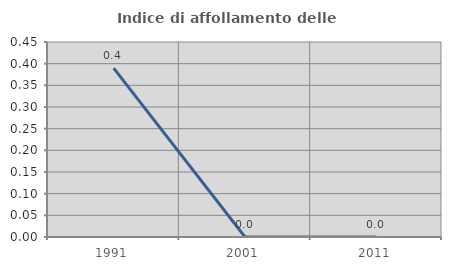
| Category | Indice di affollamento delle abitazioni  |
|---|---|
| 1991.0 | 0.39 |
| 2001.0 | 0 |
| 2011.0 | 0 |